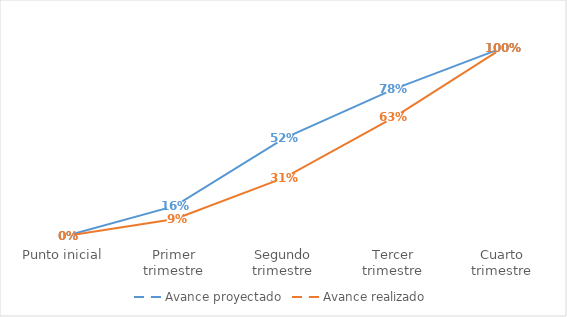
| Category | Avance proyectado |
|---|---|
| Punto inicial | 0 |
| Primer trimestre | 0.16 |
| Segundo trimestre | 0.52 |
| Tercer trimestre | 0.78 |
| Cuarto trimestre | 1 |